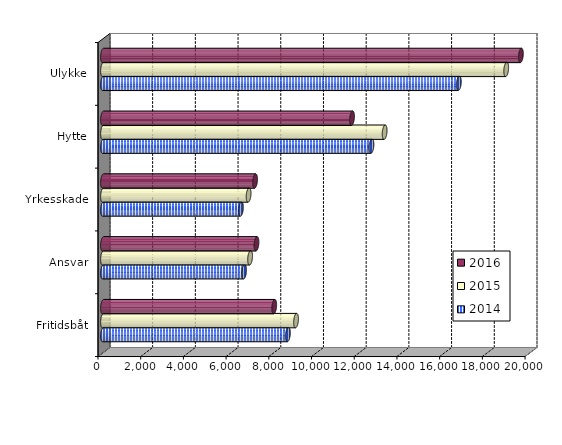
| Category | 2014 | 2015 | 2016 |
|---|---|---|---|
| Fritidsbåt | 8659 | 9041.093 | 8019.147 |
| Ansvar | 6607 | 6888.693 | 7187.708 |
| Yrkesskade | 6460 | 6819 | 7122 |
| Hytte | 12573 | 13189.706 | 11662.406 |
| Ulykke | 16664 | 18883.285 | 19570.411 |